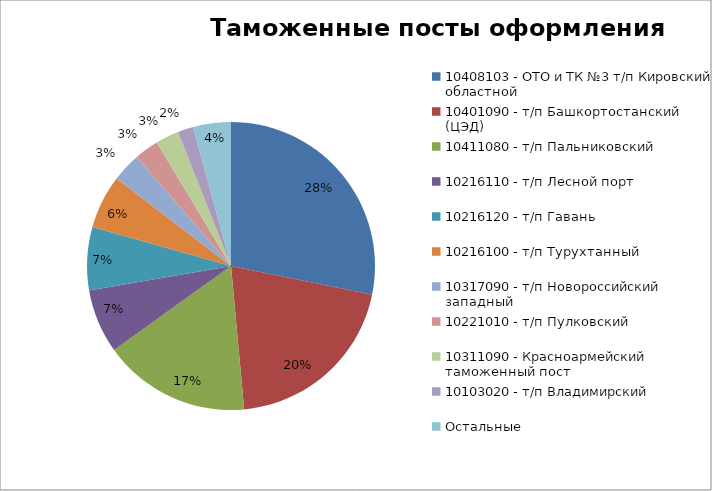
| Category | Стоимость, USD |
|---|---|
| 10408103 - ОТО и ТК №3 т/п Кировский областной | 2802336.1 |
| 10401090 - т/п Башкортостанский (ЦЭД) | 2021388.05 |
| 10411080 - т/п Пальниковский | 1644432.1 |
| 10216110 - т/п Лесной порт | 714367.5 |
| 10216120 - т/п Гавань | 704517.8 |
| 10216100 - т/п Турухтанный | 599276.46 |
| 10317090 - т/п Новороссийский западный | 324020 |
| 10221010 - т/п Пулковский | 270850 |
| 10311090 - Красноармейский таможенный пост | 260647.36 |
| 10103020 - т/п Владимирский | 174274.61 |
| Остальные | 421696.67 |